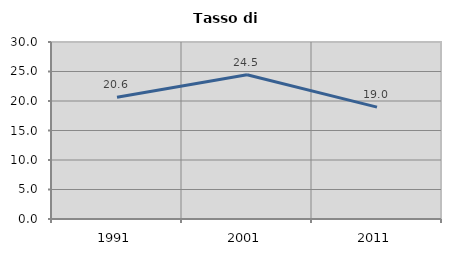
| Category | Tasso di disoccupazione   |
|---|---|
| 1991.0 | 20.621 |
| 2001.0 | 24.451 |
| 2011.0 | 18.966 |